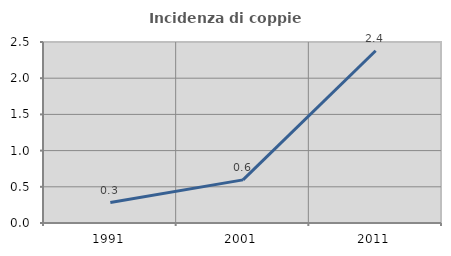
| Category | Incidenza di coppie miste |
|---|---|
| 1991.0 | 0.283 |
| 2001.0 | 0.596 |
| 2011.0 | 2.378 |